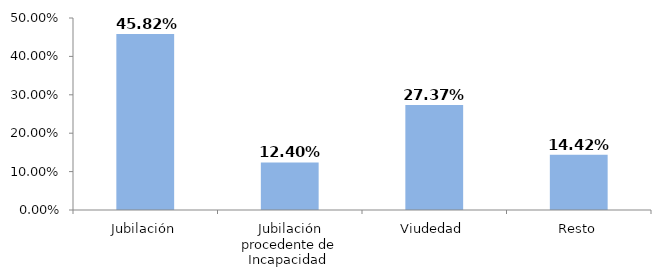
| Category | Series 0 |
|---|---|
| Jubilación | 0.458 |
| Jubilación procedente de Incapacidad  | 0.124 |
| Viudedad | 0.274 |
| Resto | 0.144 |